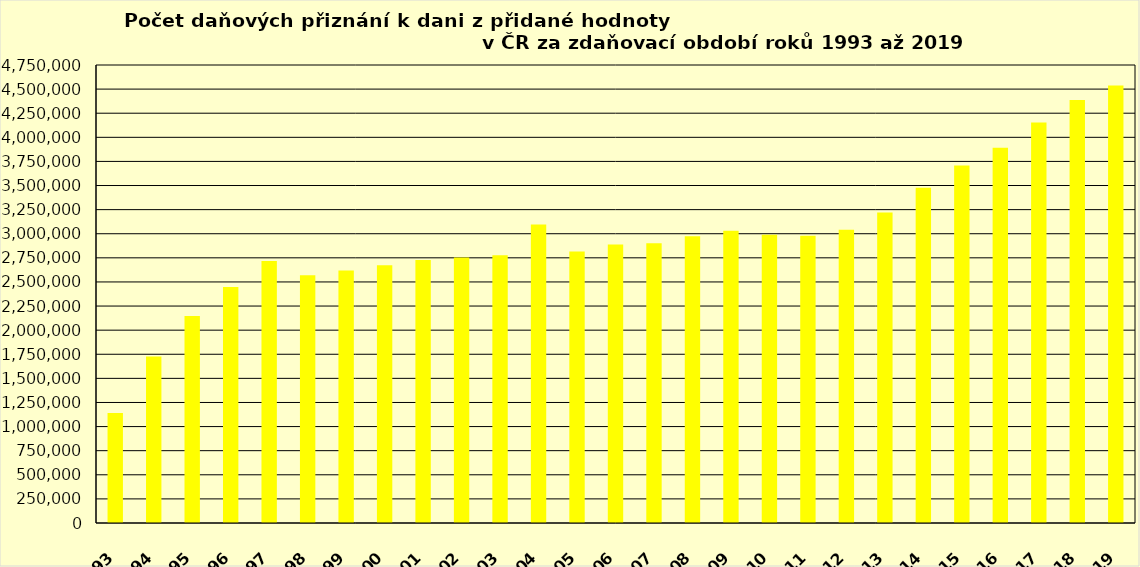
| Category | Series 0 |
|---|---|
| 1993 | 1140755 |
| 1994 | 1727290 |
| 1995 | 2147169 |
| 1996 | 2448436 |
| 1997 | 2716250 |
| 1998 | 2568304 |
| 1999 | 2617628 |
| 2000 | 2673355 |
| 2001 | 2727115 |
| 2002 | 2753616 |
| 2003 | 2776783 |
| 2004 | 3094611 |
| 2005 | 2816384 |
| 2006 | 2887845 |
| 2007 | 2902614 |
| 2008 | 2975122 |
| 2009 | 3030894 |
| 2010 | 2990251 |
| 2011 | 2980368 |
| 2012 | 3041348 |
| 2013 | 3219820 |
| 2014 | 3476453 |
| 2015 | 3707936 |
| 2016 | 3891727 |
| 2017 | 4153226 |
| 2018 | 4386977 |
| 2019 | 4536365 |